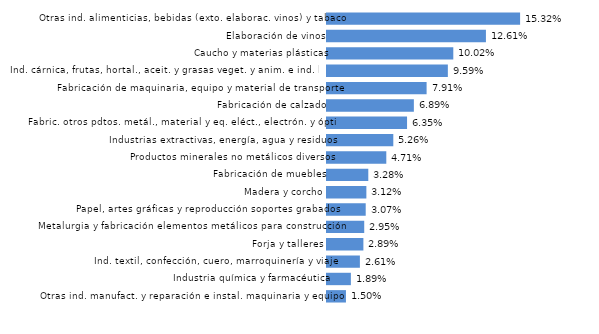
| Category | La Rioja |
|---|---|
| Otras ind. manufact. y reparación e instal. maquinaria y equipo | 0.015 |
| Industria química y farmacéutica | 0.019 |
| Ind. textil, confección, cuero, marroquinería y viaje | 0.026 |
| Forja y talleres | 0.029 |
| Metalurgia y fabricación elementos metálicos para construcción | 0.03 |
| Papel, artes gráficas y reproducción soportes grabados | 0.031 |
| Madera y corcho | 0.031 |
| Fabricación de muebles | 0.033 |
| Productos minerales no metálicos diversos | 0.047 |
| Industrias extractivas, energía, agua y residuos | 0.053 |
| Fabric. otros pdtos. metál., material y eq. eléct., electrón. y óptico | 0.064 |
| Fabricación de calzado | 0.069 |
| Fabricación de maquinaria, equipo y material de transporte | 0.079 |
| Ind. cárnica, frutas, hortal., aceit. y grasas veget. y anim. e ind. láctea | 0.096 |
| Caucho y materias plásticas | 0.1 |
| Elaboración de vinos | 0.126 |
| Otras ind. alimenticias, bebidas (exto. elaborac. vinos) y tabaco | 0.153 |